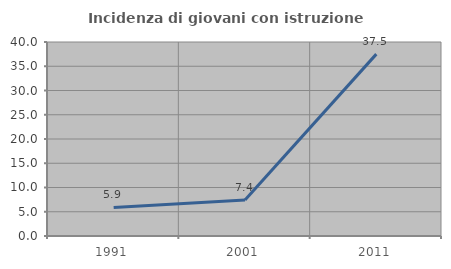
| Category | Incidenza di giovani con istruzione universitaria |
|---|---|
| 1991.0 | 5.882 |
| 2001.0 | 7.407 |
| 2011.0 | 37.5 |